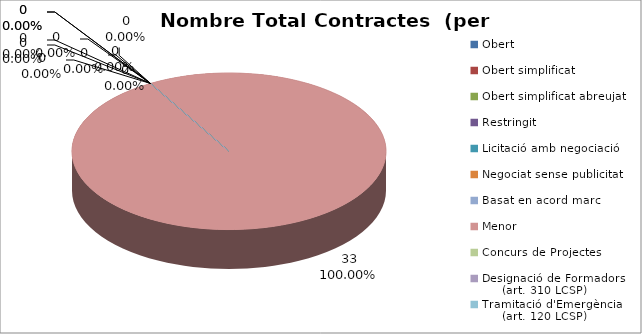
| Category | Nombre Total Contractes |
|---|---|
| Obert | 0 |
| Obert simplificat | 0 |
| Obert simplificat abreujat | 0 |
| Restringit | 0 |
| Licitació amb negociació | 0 |
| Negociat sense publicitat | 0 |
| Basat en acord marc | 0 |
| Menor | 33 |
| Concurs de Projectes | 0 |
| Designació de Formadors
     (art. 310 LCSP) | 0 |
| Tramitació d'Emergència
     (art. 120 LCSP) | 0 |